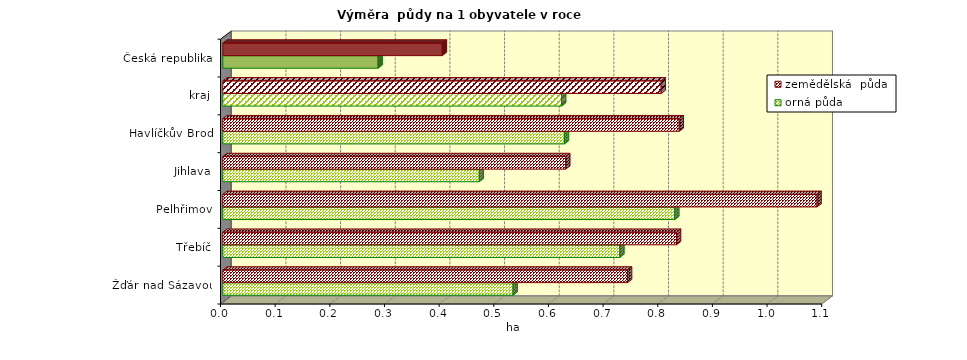
| Category | orná půda | zemědělská  půda |
|---|---|---|
| Žďár nad Sázavou | 0.531 | 0.74 |
| Třebíč | 0.726 | 0.83 |
| Pelhřimov | 0.827 | 1.087 |
| Jihlava | 0.469 | 0.627 |
| Havlíčkův Brod | 0.625 | 0.835 |
| kraj | 0.62 | 0.802 |
| Česká republika | 0.284 | 0.401 |